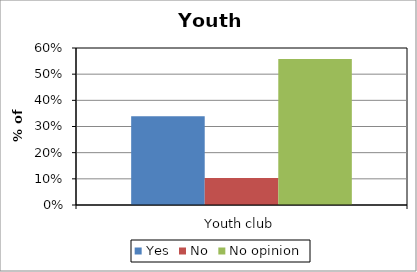
| Category | Yes | No | No opinion |
|---|---|---|---|
| Youth club | 0.339 | 0.103 | 0.558 |